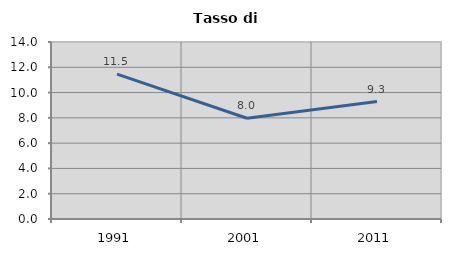
| Category | Tasso di disoccupazione   |
|---|---|
| 1991.0 | 11.462 |
| 2001.0 | 7.97 |
| 2011.0 | 9.29 |